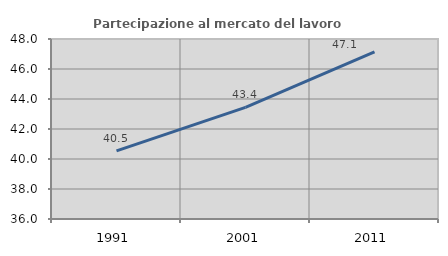
| Category | Partecipazione al mercato del lavoro  femminile |
|---|---|
| 1991.0 | 40.541 |
| 2001.0 | 43.442 |
| 2011.0 | 47.143 |